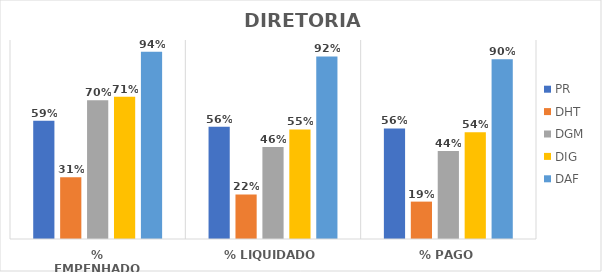
| Category | PR | DHT | DGM | DIG | DAF |
|---|---|---|---|---|---|
| % EMPENHADO | 0.594 | 0.31 | 0.698 | 0.714 | 0.94 |
| % LIQUIDADO | 0.565 | 0.224 | 0.462 | 0.551 | 0.917 |
| % PAGO | 0.556 | 0.188 | 0.442 | 0.536 | 0.904 |